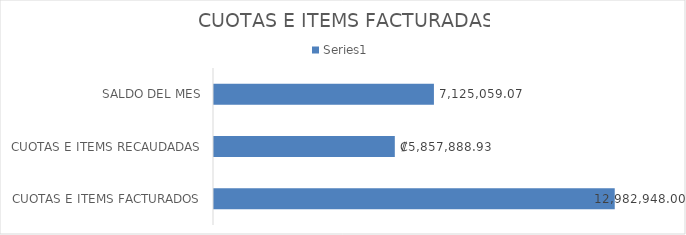
| Category | Series 0 |
|---|---|
| CUOTAS E ITEMS FACTURADOS | 12982948 |
| CUOTAS E ITEMS RECAUDADAS | 5857888.93 |
| SALDO DEL MES | 7125059.07 |